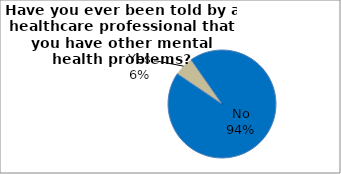
| Category | Series 0 |
|---|---|
| No | 94.184 |
| Yes | 5.816 |